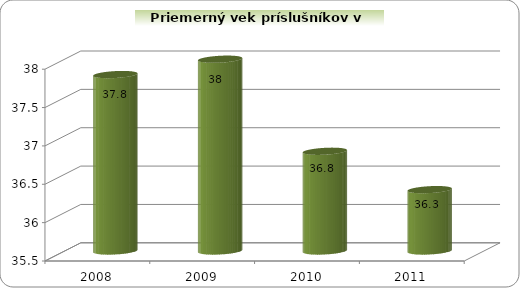
| Category | Priemerný vek príslušníkov v rokoch |
|---|---|
| 2008.0 | 37.8 |
| 2009.0 | 38 |
| 2010.0 | 36.8 |
| 2011.0 | 36.3 |